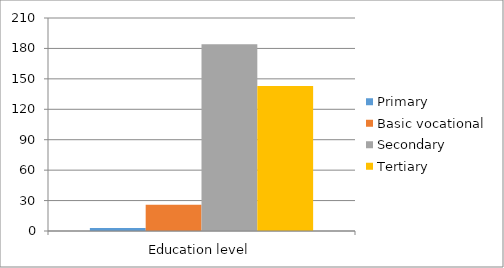
| Category | Primary | Basic vocational | Secondary | Tertiary |
|---|---|---|---|---|
| Education level | 3 | 26 | 184 | 143 |